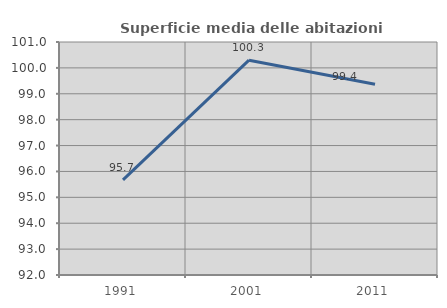
| Category | Superficie media delle abitazioni occupate |
|---|---|
| 1991.0 | 95.673 |
| 2001.0 | 100.297 |
| 2011.0 | 99.367 |